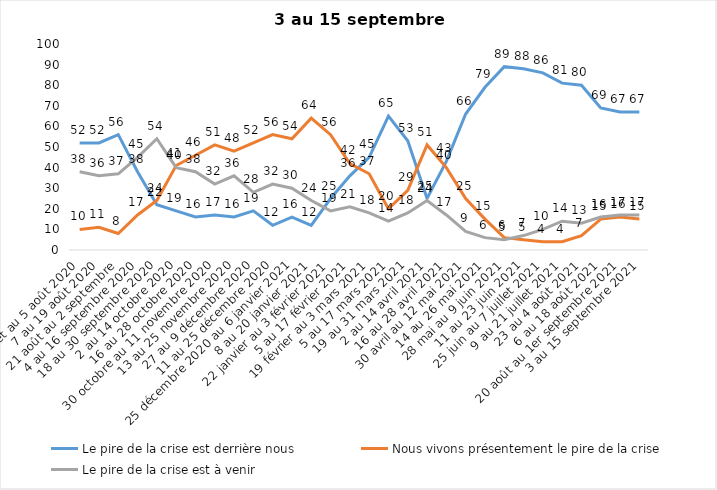
| Category | Le pire de la crise est derrière nous | Nous vivons présentement le pire de la crise | Le pire de la crise est à venir |
|---|---|---|---|
| 24 juillet au 5 août 2020 | 52 | 10 | 38 |
| 7 au 19 août 2020 | 52 | 11 | 36 |
| 21 août au 2 septembre | 56 | 8 | 37 |
| 4 au 16 septembre 2020 | 38 | 17 | 45 |
| 18 au 30 septembre 2020 | 22 | 24 | 54 |
| 2 au 14 octobre 2020 | 19 | 41 | 40 |
| 16 au 28 octobre 2020 | 16 | 46 | 38 |
| 30 octobre au 11 novembre 2020 | 17 | 51 | 32 |
| 13 au 25 novembre 2020 | 16 | 48 | 36 |
| 27 au 9 décembre 2020 | 19 | 52 | 28 |
| 11 au 25 décembre 2020 | 12 | 56 | 32 |
| 25 décembre 2020 au 6 janvier 2021 | 16 | 54 | 30 |
| 8 au 20 janvier 2021 | 12 | 64 | 24 |
| 22 janvier au 3 février 2021 | 25 | 56 | 19 |
| 5 au 17 février 2021 | 36 | 42 | 21 |
| 19 février au 3 mars 2021 | 45 | 37 | 18 |
| 5 au 17 mars 2021 | 65 | 20 | 14 |
| 19 au 31 mars 2021 | 53 | 29 | 18 |
| 2 au 14 avril 2021 | 25 | 51 | 24 |
| 16 au 28 avril 2021 | 43 | 40 | 17 |
| 30 avril au 12 mai 2021 | 66 | 25 | 9 |
| 14 au 26 mai 2021 | 79 | 15 | 6 |
| 28 mai au 9 juin 2021 | 89 | 6 | 5 |
| 11 au 23 juin 2021 | 88 | 5 | 7 |
| 25 juin au 7 juillet 2021 | 86 | 4 | 10 |
| 9 au 21 juillet 2021 | 81 | 4 | 14 |
| 23 au 4 août 2021 | 80 | 7 | 13 |
| 6 au 18 août 2021 | 69 | 15 | 16 |
| 20 août au 1er septembre 2021 | 67 | 16 | 17 |
| 3 au 15 septembre 2021 | 67 | 15 | 17 |